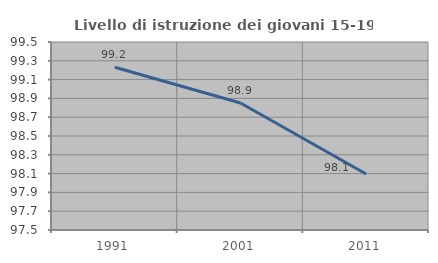
| Category | Livello di istruzione dei giovani 15-19 anni |
|---|---|
| 1991.0 | 99.231 |
| 2001.0 | 98.851 |
| 2011.0 | 98.095 |